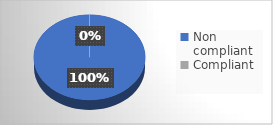
| Category | Series 0 |
|---|---|
| Non compliant | 24 |
| Compliant | 0 |